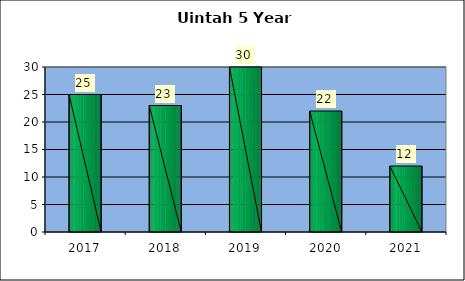
| Category | Washington Terrace March 5 Year Comparison |
|---|---|
| 0 | 25 |
| 1 | 23 |
| 2 | 30 |
| 3 | 22 |
| 4 | 12 |